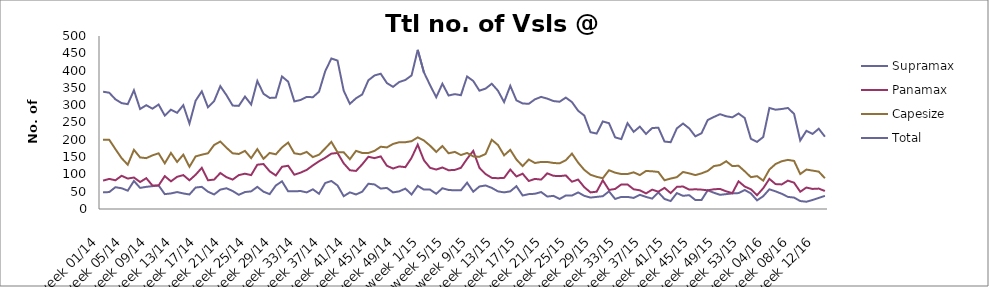
| Category | Supramax | Panamax | Capesize | Total |
|---|---|---|---|---|
| week 01/14 | 48 | 82 | 200 | 339 |
| week 02/14 | 49 | 87 | 200 | 336 |
| week 03/14 | 63 | 83 | 173 | 317 |
| week 04/14 | 60 | 96 | 147 | 306 |
| week 05/14 | 53 | 88 | 128 | 303 |
| week 06/14 | 81 | 91 | 171 | 343 |
| week 07/14 | 61 | 78 | 149 | 289 |
| week 08/14 | 64 | 89 | 147 | 300 |
| week 09/14 | 66 | 68 | 155 | 290 |
| week 10/14 | 68 | 68 | 161 | 302 |
| week 11/14 | 43 | 95 | 132 | 270 |
| week 12/14 | 45 | 80 | 162 | 287 |
| week 13/14 | 49 | 93 | 136 | 278 |
| week 14/14 | 45 | 98 | 157 | 300 |
| week 15/14 | 42 | 83 | 122 | 247 |
| week 16/14 | 62 | 99 | 152 | 313 |
| week 17/14 | 64 | 119 | 157 | 340 |
| week 18/14 | 50 | 83 | 161 | 294 |
| week 19/14 | 42 | 85 | 185 | 312 |
| week 20/14 | 56 | 104 | 195 | 355 |
| week 21/14 | 60 | 92 | 177 | 329 |
| week 22/14 | 52 | 85 | 161 | 299 |
| week 23/14 | 41 | 98 | 159 | 298 |
| week 24/14 | 49 | 102 | 168 | 325 |
| week 25/14 | 51 | 98 | 147 | 302 |
| week 26/14 | 64 | 128 | 173 | 370 |
| week 27/14 | 50 | 130 | 145 | 333 |
| week 28/14 | 43 | 109 | 162 | 321 |
| week 29/14 | 68 | 97 | 158 | 322 |
| week 30/14 | 80 | 122 | 178 | 383 |
| week 31/14 | 51 | 125 | 192 | 368 |
| week 32/14 | 51 | 99 | 161 | 311 |
| week 33/14 | 52 | 105 | 158 | 315 |
| week 34/14 | 48 | 113 | 165 | 324 |
| week 35/14 | 57 | 126 | 150 | 323 |
| week 36/14 | 44 | 138 | 157 | 339 |
| week 37/14 | 75 | 148 | 175 | 398 |
| week 38/14 | 81 | 160 | 194 | 435 |
| week 39/14 | 68 | 162 | 164 | 429 |
| week 40/14 | 37 | 132 | 164 | 342 |
| week 41/14 | 48 | 112 | 144 | 304 |
| week 42/14 | 42 | 110 | 168 | 320 |
| week 43/14 | 50 | 129 | 162 | 331 |
| week 44/14 | 73 | 151 | 162 | 372 |
| week 45/14 | 71 | 147 | 168 | 386 |
| week 46/14 | 59 | 152 | 180 | 391 |
| week 47/14 | 61 | 125 | 178 | 364 |
| week 48/14 | 48 | 117 | 188 | 353 |
| week 49/14 | 51 | 123 | 193 | 367 |
| week 50/14 | 59 | 121 | 193 | 373 |
| week 51/14 | 42 | 148 | 196 | 386 |
| week 52/14 | 67 | 186 | 207 | 460 |
| week 1/15 | 56 | 141 | 198 | 395 |
| week 2/15 | 56 | 119 | 183 | 358 |
| week 3/15 | 44 | 114 | 165 | 323 |
| week 4/15 | 60 | 120 | 182 | 362 |
| week 5/15 | 55 | 112 | 161 | 328 |
| week 6/15 | 54 | 113 | 165 | 332 |
| week 7/15 | 54 | 119 | 156 | 329 |
| week 8/15 | 76 | 145 | 162 | 383 |
| week 9/15 | 50 | 168 | 152 | 370 |
| week 10/15 | 65 | 119 | 151 | 342 |
| week 11/15 | 68 | 101 | 159 | 348 |
| week 12/15 | 61 | 90 | 200 | 362 |
| week 13/15 | 51 | 89 | 185 | 342 |
| week 14/15 | 48 | 90 | 155 | 309 |
| week 15/15 | 51 | 114 | 171 | 356 |
| week 16/15 | 66 | 94 | 143 | 314 |
| week 17/15 | 39 | 102 | 124 | 305 |
| week 18/15 | 43 | 81 | 143 | 304 |
| week 19/15 | 44 | 87 | 133 | 317 |
| week 20/15 | 49 | 85 | 136 | 324 |
| week 21/15 | 36 | 103 | 136 | 319 |
| week 22/15 | 38 | 96 | 133 | 312 |
| week 23/15 | 29 | 95 | 132 | 310 |
| week 24/15 | 39 | 97 | 141 | 322 |
| week 25/15 | 39 | 79 | 160 | 309 |
| week 26/15 | 48 | 85 | 134 | 284 |
| week 27/15 | 38 | 63 | 113 | 270 |
| week 28/15 | 33 | 48 | 99 | 222 |
| week 29/15 | 35 | 50 | 93 | 218 |
| week 30/15 | 37 | 83 | 89 | 253 |
| week 31/15 | 51 | 55 | 112 | 248 |
| week 32/15 | 29 | 58 | 105 | 207 |
| week 33/15 | 35 | 71 | 101 | 202 |
| week 34/15 | 35 | 71 | 101 | 248 |
| week 35/15 | 32 | 57 | 106 | 223 |
| week 36/15 | 41 | 54 | 98 | 238 |
| week 37/15 | 35 | 45 | 110 | 217 |
| week 38/15 | 30 | 56 | 109 | 234 |
| week 39/15 | 48 | 50 | 107 | 235 |
| week 40/15 | 29 | 61 | 83 | 195 |
| week 41/15 | 23 | 46 | 88 | 193 |
| week 42/15 | 46 | 64 | 92 | 233 |
| week 43/15 | 38 | 65 | 107 | 247 |
| week 44/15 | 40 | 56 | 103 | 233 |
| week 45/15 | 26 | 57 | 98 | 210 |
| week 46/15 | 26 | 56 | 103 | 219 |
| week 47/15 | 54 | 54 | 110 | 257 |
| week 48/15 | 47 | 57 | 124 | 266 |
| week 49/15 | 41 | 58 | 127 | 274 |
| week 50/15 | 43 | 51 | 138 | 268 |
| week 51/15 | 45 | 46 | 124 | 265 |
| week 52/15 | 46 | 80 | 125 | 276 |
| week 53/15 | 55 | 65 | 109 | 263 |
| week 01/16 | 45 | 57 | 92 | 203 |
| week 02/16 | 25 | 40 | 95 | 194 |
| week 03/16 | 37 | 60 | 82 | 208 |
| week 04/16 | 57 | 87 | 114 | 292 |
| week 05/16 | 51 | 72 | 130 | 287 |
| week 06/16 | 44 | 71 | 138 | 289 |
| week 07/16 | 35 | 82 | 142 | 292 |
| week 08/16 | 33 | 76 | 139 | 275 |
| week 09/16 | 23 | 50 | 101 | 198 |
| week 10/16 | 21 | 62 | 114 | 226 |
| week 11/16 | 26 | 58 | 111 | 217 |
| week 12/16 | 32 | 59 | 108 | 232 |
| week 13/16 | 38 | 52 | 89 | 209 |